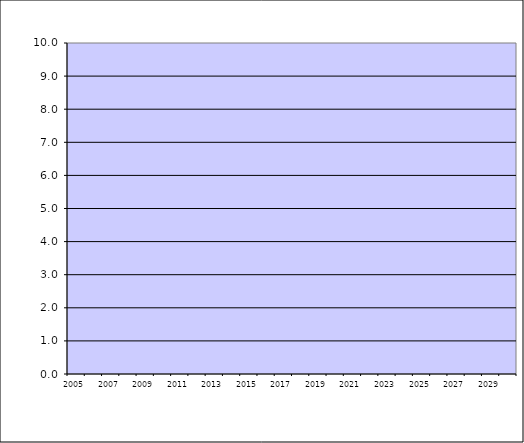
| Category | Series 2 |
|---|---|
| 2005.0 | 0 |
| 2006.0 | 0 |
| 2007.0 | 0 |
| 2008.0 | 0 |
| 2009.0 | 0 |
| 2010.0 | 0 |
| 2011.0 | 0 |
| 2012.0 | 0 |
| 2013.0 | 0 |
| 2014.0 | 0 |
| 2015.0 | 0 |
| 2016.0 | 0 |
| 2017.0 | 0 |
| 2018.0 | 0 |
| 2019.0 | 0 |
| 2020.0 | 0 |
| 2021.0 | 0 |
| 2022.0 | 0 |
| 2023.0 | 0 |
| 2024.0 | 0 |
| 2025.0 | 0 |
| 2026.0 | 0 |
| 2027.0 | 0 |
| 2028.0 | 0 |
| 2029.0 | 0 |
| 2030.0 | 0 |